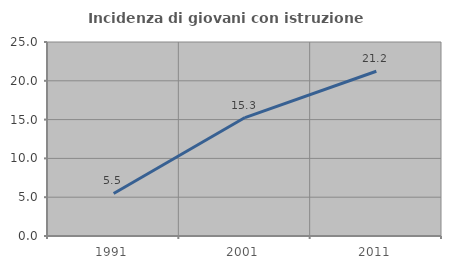
| Category | Incidenza di giovani con istruzione universitaria |
|---|---|
| 1991.0 | 5.479 |
| 2001.0 | 15.263 |
| 2011.0 | 21.229 |